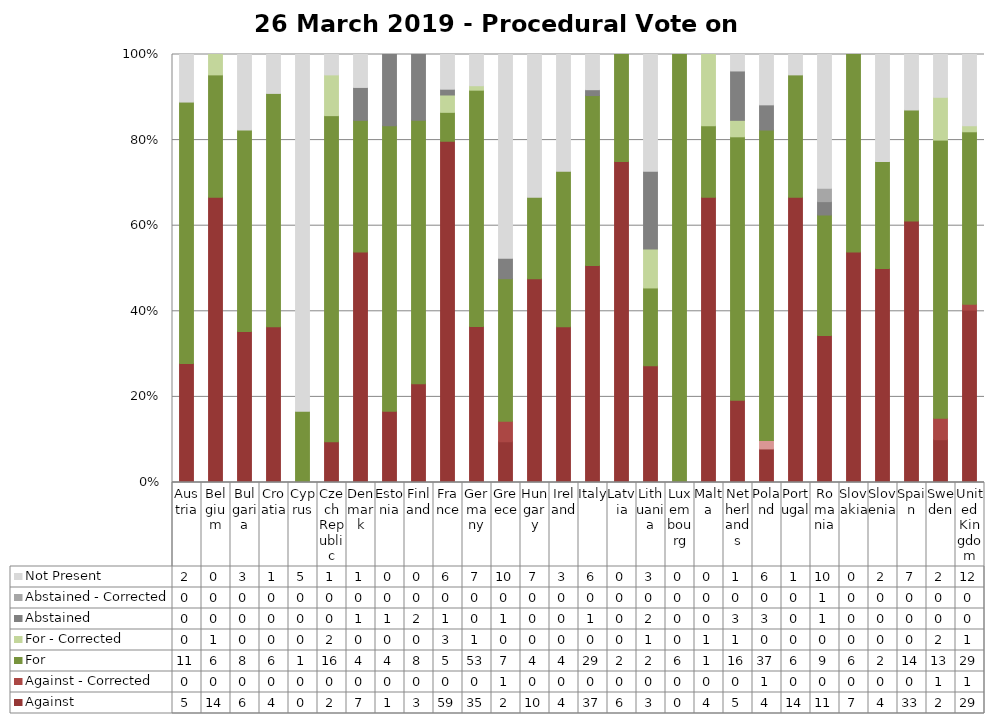
| Category | Against | Against - Corrected | For | For - Corrected | Abstained | Abstained - Corrected | Not Present |
|---|---|---|---|---|---|---|---|
| Austria | 5 | 0 | 11 | 0 | 0 | 0 | 2 |
| Belgium | 14 | 0 | 6 | 1 | 0 | 0 | 0 |
| Bulgaria | 6 | 0 | 8 | 0 | 0 | 0 | 3 |
| Croatia | 4 | 0 | 6 | 0 | 0 | 0 | 1 |
| Cyprus | 0 | 0 | 1 | 0 | 0 | 0 | 5 |
| Czech Republic | 2 | 0 | 16 | 2 | 0 | 0 | 1 |
| Denmark | 7 | 0 | 4 | 0 | 1 | 0 | 1 |
| Estonia | 1 | 0 | 4 | 0 | 1 | 0 | 0 |
| Finland | 3 | 0 | 8 | 0 | 2 | 0 | 0 |
| France | 59 | 0 | 5 | 3 | 1 | 0 | 6 |
| Germany | 35 | 0 | 53 | 1 | 0 | 0 | 7 |
| Greece | 2 | 1 | 7 | 0 | 1 | 0 | 10 |
| Hungary | 10 | 0 | 4 | 0 | 0 | 0 | 7 |
| Ireland | 4 | 0 | 4 | 0 | 0 | 0 | 3 |
| Italy | 37 | 0 | 29 | 0 | 1 | 0 | 6 |
| Latvia | 6 | 0 | 2 | 0 | 0 | 0 | 0 |
| Lithuania | 3 | 0 | 2 | 1 | 2 | 0 | 3 |
| Luxembourg | 0 | 0 | 6 | 0 | 0 | 0 | 0 |
| Malta | 4 | 0 | 1 | 1 | 0 | 0 | 0 |
| Netherlands | 5 | 0 | 16 | 1 | 3 | 0 | 1 |
| Poland | 4 | 1 | 37 | 0 | 3 | 0 | 6 |
| Portugal | 14 | 0 | 6 | 0 | 0 | 0 | 1 |
| Romania | 11 | 0 | 9 | 0 | 1 | 1 | 10 |
| Slovakia | 7 | 0 | 6 | 0 | 0 | 0 | 0 |
| Slovenia | 4 | 0 | 2 | 0 | 0 | 0 | 2 |
| Spain | 33 | 0 | 14 | 0 | 0 | 0 | 7 |
| Sweden | 2 | 1 | 13 | 2 | 0 | 0 | 2 |
| United Kingdom | 29 | 1 | 29 | 1 | 0 | 0 | 12 |